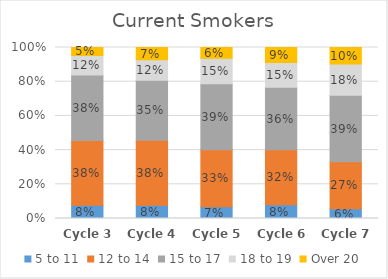
| Category | 5 to 11 | 12 to 14 | 15 to 17 | 18 to 19 | Over 20 |
|---|---|---|---|---|---|
| Cycle 3 | 0.077 | 0.379 | 0.383 | 0.115 | 0.046 |
| Cycle 4 | 0.078 | 0.381 | 0.35 | 0.12 | 0.071 |
| Cycle 5 | 0.068 | 0.333 | 0.386 | 0.15 | 0.063 |
| Cycle 6 | 0.08 | 0.323 | 0.364 | 0.146 | 0.087 |
| Cycle 7 | 0.057 | 0.275 | 0.389 | 0.183 | 0.096 |